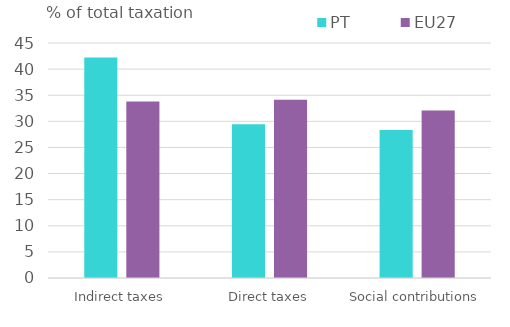
| Category | PT | EU27 |
|---|---|---|
| Indirect taxes | 42.223 | 33.811 |
| Direct taxes | 29.441 | 34.133 |
| Social contributions | 28.337 | 32.056 |